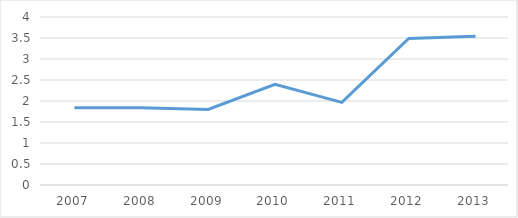
| Category | Series 0 |
|---|---|
| 2007.0 | 1.84 |
| 2008.0 | 1.84 |
| 2009.0 | 1.798 |
| 2010.0 | 2.395 |
| 2011.0 | 1.966 |
| 2012.0 | 3.488 |
| 2013.0 | 3.542 |